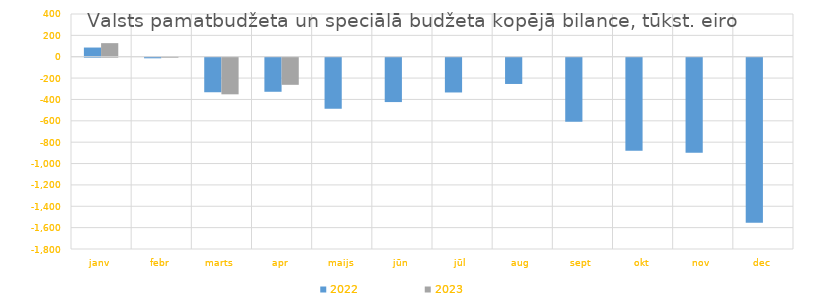
| Category | 2022 | 2023 |
|---|---|---|
| janv | 85977.566 | 127204.091 |
| febr | -5472.016 | 2640.716 |
| marts | -323198.32 | -342545.514 |
| apr | -318736.122 | -253652.641 |
| maijs | -477330.976 | 0 |
| jūn | -415131.505 | 0 |
| jūl | -325256.633 | 0 |
| aug | -245672.594 | 0 |
| sept | -599017.929 | 0 |
| okt | -870438.915 | 0 |
| nov | -890453.865 | 0 |
| dec | -1545721.851 | 0 |